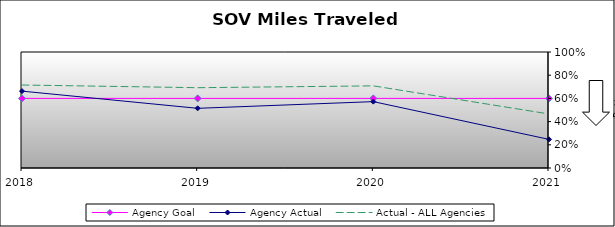
| Category | Agency Goal | Agency Actual | Actual - ALL Agencies |
|---|---|---|---|
| 2018.0 | 0.6 | 0.663 | 0.715 |
| 2019.0 | 0.6 | 0.514 | 0.692 |
| 2020.0 | 0.6 | 0.572 | 0.708 |
| 2021.0 | 0.6 | 0.247 | 0.466 |